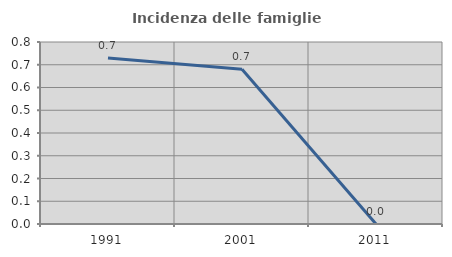
| Category | Incidenza delle famiglie numerose |
|---|---|
| 1991.0 | 0.73 |
| 2001.0 | 0.68 |
| 2011.0 | 0 |